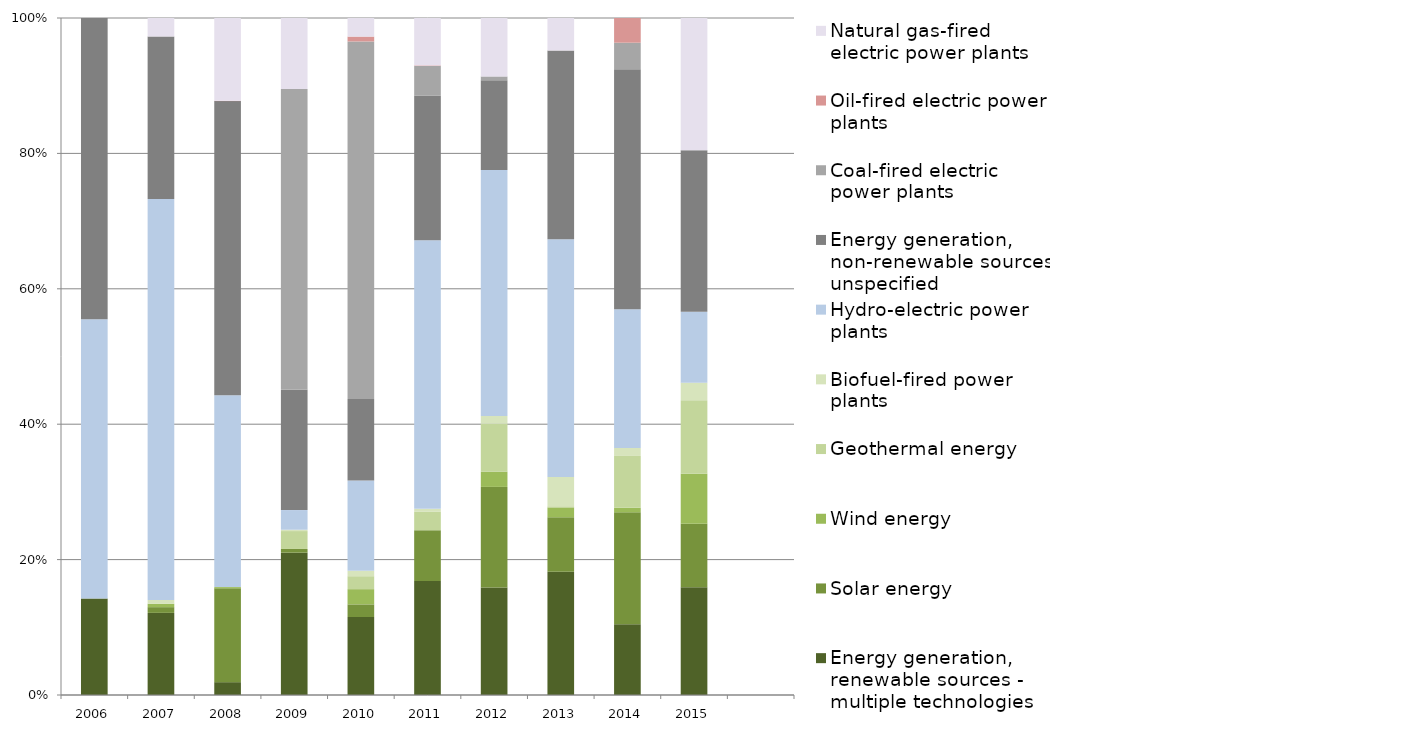
| Category | Energy generation, renewable sources - multiple technologies | Solar energy | Wind energy | Geothermal energy | Biofuel-fired power plants | Hydro-electric power plants | Energy generation, non-renewable sources, unspecified | Coal-fired electric power plants | Oil-fired electric power plants | Natural gas-fired electric power plants |
|---|---|---|---|---|---|---|---|---|---|---|
| 2006.0 | 327.55 | 0 | 0 | 0 | 0 | 946.939 | 1021.483 | 0 | 0 | 0 |
| 2007.0 | 240.487 | 16.832 | 9.895 | 0 | 11.147 | 1174.148 | 476.245 | 0 | 0 | 54.12 |
| 2008.0 | 31.134 | 227.49 | 3.072 | 0 | 0 | 465.113 | 713.677 | 0 | 0.832 | 200.735 |
| 2009.0 | 1456.731 | 38.26 | 0 | 183.203 | 13.674 | 201.496 | 1230.993 | 3078.384 | 0 | 727.892 |
| 2010.0 | 1003.557 | 162.54 | 195.989 | 166.538 | 70.103 | 1161.88 | 1049.441 | 4599.926 | 62.733 | 239.274 |
| 2011.0 | 902.135 | 401.128 | 0 | 145.531 | 23.623 | 2125.208 | 1144.543 | 233.238 | 4.933 | 374.928 |
| 2012.0 | 876.258 | 820.599 | 125.38 | 392.764 | 60.571 | 2006.512 | 731.583 | 30.665 | 0 | 476.613 |
| 2013.0 | 631.254 | 279.235 | 50.314 | 5.796 | 150.412 | 1217.481 | 966.231 | 0 | 0 | 166.788 |
| 2014.0 | 587.635 | 929.184 | 39.228 | 428.528 | 66.153 | 1152.004 | 1992.827 | 220 | 205 | 0 |
| 2015.0 | 521.292 | 307.695 | 242.294 | 356.809 | 84.362 | 344.162 | 781.985 | 0 | 0 | 640.296 |